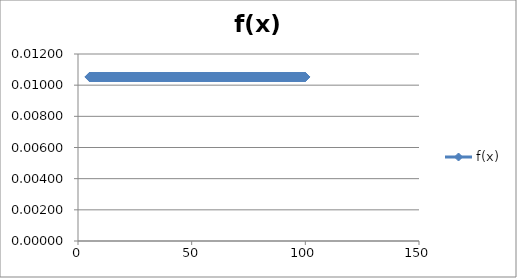
| Category | f(x) |
|---|---|
| 5.0 | 0.011 |
| 5.095 | 0.011 |
| 5.1899999999999995 | 0.011 |
| 5.284999999999999 | 0.011 |
| 5.379999999999999 | 0.011 |
| 5.474999999999999 | 0.011 |
| 5.5699999999999985 | 0.011 |
| 5.664999999999998 | 0.011 |
| 5.759999999999998 | 0.011 |
| 5.854999999999998 | 0.011 |
| 5.9499999999999975 | 0.011 |
| 6.044999999999997 | 0.011 |
| 6.139999999999997 | 0.011 |
| 6.234999999999997 | 0.011 |
| 6.3299999999999965 | 0.011 |
| 6.424999999999996 | 0.011 |
| 6.519999999999996 | 0.011 |
| 6.614999999999996 | 0.011 |
| 6.7099999999999955 | 0.011 |
| 6.804999999999995 | 0.011 |
| 6.899999999999995 | 0.011 |
| 6.994999999999995 | 0.011 |
| 7.0899999999999945 | 0.011 |
| 7.184999999999994 | 0.011 |
| 7.279999999999994 | 0.011 |
| 7.374999999999994 | 0.011 |
| 7.4699999999999935 | 0.011 |
| 7.564999999999993 | 0.011 |
| 7.659999999999993 | 0.011 |
| 7.754999999999993 | 0.011 |
| 7.8499999999999925 | 0.011 |
| 7.944999999999992 | 0.011 |
| 8.039999999999992 | 0.011 |
| 8.134999999999993 | 0.011 |
| 8.229999999999993 | 0.011 |
| 8.324999999999994 | 0.011 |
| 8.419999999999995 | 0.011 |
| 8.514999999999995 | 0.011 |
| 8.609999999999996 | 0.011 |
| 8.704999999999997 | 0.011 |
| 8.799999999999997 | 0.011 |
| 8.894999999999998 | 0.011 |
| 8.989999999999998 | 0.011 |
| 9.084999999999999 | 0.011 |
| 9.18 | 0.011 |
| 9.275 | 0.011 |
| 9.370000000000001 | 0.011 |
| 9.465000000000002 | 0.011 |
| 9.560000000000002 | 0.011 |
| 9.655000000000003 | 0.011 |
| 9.750000000000004 | 0.011 |
| 9.845000000000004 | 0.011 |
| 9.940000000000005 | 0.011 |
| 10.035000000000005 | 0.011 |
| 10.130000000000006 | 0.011 |
| 10.225000000000007 | 0.011 |
| 10.320000000000007 | 0.011 |
| 10.415000000000008 | 0.011 |
| 10.510000000000009 | 0.011 |
| 10.60500000000001 | 0.011 |
| 10.70000000000001 | 0.011 |
| 10.79500000000001 | 0.011 |
| 10.890000000000011 | 0.011 |
| 10.985000000000012 | 0.011 |
| 11.080000000000013 | 0.011 |
| 11.175000000000013 | 0.011 |
| 11.270000000000014 | 0.011 |
| 11.365000000000014 | 0.011 |
| 11.460000000000015 | 0.011 |
| 11.555000000000016 | 0.011 |
| 11.650000000000016 | 0.011 |
| 11.745000000000017 | 0.011 |
| 11.840000000000018 | 0.011 |
| 11.935000000000018 | 0.011 |
| 12.030000000000019 | 0.011 |
| 12.12500000000002 | 0.011 |
| 12.22000000000002 | 0.011 |
| 12.31500000000002 | 0.011 |
| 12.410000000000021 | 0.011 |
| 12.505000000000022 | 0.011 |
| 12.600000000000023 | 0.011 |
| 12.695000000000023 | 0.011 |
| 12.790000000000024 | 0.011 |
| 12.885000000000025 | 0.011 |
| 12.980000000000025 | 0.011 |
| 13.075000000000026 | 0.011 |
| 13.170000000000027 | 0.011 |
| 13.265000000000027 | 0.011 |
| 13.360000000000028 | 0.011 |
| 13.455000000000028 | 0.011 |
| 13.55000000000003 | 0.011 |
| 13.64500000000003 | 0.011 |
| 13.74000000000003 | 0.011 |
| 13.835000000000031 | 0.011 |
| 13.930000000000032 | 0.011 |
| 14.025000000000032 | 0.011 |
| 14.120000000000033 | 0.011 |
| 14.215000000000034 | 0.011 |
| 14.310000000000034 | 0.011 |
| 14.405000000000035 | 0.011 |
| 14.500000000000036 | 0.011 |
| 14.595000000000036 | 0.011 |
| 14.690000000000037 | 0.011 |
| 14.785000000000037 | 0.011 |
| 14.880000000000038 | 0.011 |
| 14.975000000000039 | 0.011 |
| 15.07000000000004 | 0.011 |
| 15.16500000000004 | 0.011 |
| 15.26000000000004 | 0.011 |
| 15.355000000000041 | 0.011 |
| 15.450000000000042 | 0.011 |
| 15.545000000000043 | 0.011 |
| 15.640000000000043 | 0.011 |
| 15.735000000000044 | 0.011 |
| 15.830000000000044 | 0.011 |
| 15.925000000000045 | 0.011 |
| 16.020000000000046 | 0.011 |
| 16.115000000000045 | 0.011 |
| 16.210000000000043 | 0.011 |
| 16.305000000000042 | 0.011 |
| 16.40000000000004 | 0.011 |
| 16.49500000000004 | 0.011 |
| 16.59000000000004 | 0.011 |
| 16.685000000000038 | 0.011 |
| 16.780000000000037 | 0.011 |
| 16.875000000000036 | 0.011 |
| 16.970000000000034 | 0.011 |
| 17.065000000000033 | 0.011 |
| 17.160000000000032 | 0.011 |
| 17.25500000000003 | 0.011 |
| 17.35000000000003 | 0.011 |
| 17.44500000000003 | 0.011 |
| 17.540000000000028 | 0.011 |
| 17.635000000000026 | 0.011 |
| 17.730000000000025 | 0.011 |
| 17.825000000000024 | 0.011 |
| 17.920000000000023 | 0.011 |
| 18.015000000000022 | 0.011 |
| 18.11000000000002 | 0.011 |
| 18.20500000000002 | 0.011 |
| 18.30000000000002 | 0.011 |
| 18.395000000000017 | 0.011 |
| 18.490000000000016 | 0.011 |
| 18.585000000000015 | 0.011 |
| 18.680000000000014 | 0.011 |
| 18.775000000000013 | 0.011 |
| 18.87000000000001 | 0.011 |
| 18.96500000000001 | 0.011 |
| 19.06000000000001 | 0.011 |
| 19.15500000000001 | 0.011 |
| 19.250000000000007 | 0.011 |
| 19.345000000000006 | 0.011 |
| 19.440000000000005 | 0.011 |
| 19.535000000000004 | 0.011 |
| 19.630000000000003 | 0.011 |
| 19.725 | 0.011 |
| 19.82 | 0.011 |
| 19.915 | 0.011 |
| 20.009999999999998 | 0.011 |
| 20.104999999999997 | 0.011 |
| 20.199999999999996 | 0.011 |
| 20.294999999999995 | 0.011 |
| 20.389999999999993 | 0.011 |
| 20.484999999999992 | 0.011 |
| 20.57999999999999 | 0.011 |
| 20.67499999999999 | 0.011 |
| 20.76999999999999 | 0.011 |
| 20.864999999999988 | 0.011 |
| 20.959999999999987 | 0.011 |
| 21.054999999999986 | 0.011 |
| 21.149999999999984 | 0.011 |
| 21.244999999999983 | 0.011 |
| 21.339999999999982 | 0.011 |
| 21.43499999999998 | 0.011 |
| 21.52999999999998 | 0.011 |
| 21.62499999999998 | 0.011 |
| 21.719999999999978 | 0.011 |
| 21.814999999999976 | 0.011 |
| 21.909999999999975 | 0.011 |
| 22.004999999999974 | 0.011 |
| 22.099999999999973 | 0.011 |
| 22.194999999999972 | 0.011 |
| 22.28999999999997 | 0.011 |
| 22.38499999999997 | 0.011 |
| 22.47999999999997 | 0.011 |
| 22.574999999999967 | 0.011 |
| 22.669999999999966 | 0.011 |
| 22.764999999999965 | 0.011 |
| 22.859999999999964 | 0.011 |
| 22.954999999999963 | 0.011 |
| 23.04999999999996 | 0.011 |
| 23.14499999999996 | 0.011 |
| 23.23999999999996 | 0.011 |
| 23.334999999999958 | 0.011 |
| 23.429999999999957 | 0.011 |
| 23.524999999999956 | 0.011 |
| 23.619999999999955 | 0.011 |
| 23.714999999999954 | 0.011 |
| 23.809999999999953 | 0.011 |
| 23.90499999999995 | 0.011 |
| 23.99999999999995 | 0.011 |
| 24.09499999999995 | 0.011 |
| 24.189999999999948 | 0.011 |
| 24.284999999999947 | 0.011 |
| 24.379999999999946 | 0.011 |
| 24.474999999999945 | 0.011 |
| 24.569999999999943 | 0.011 |
| 24.664999999999942 | 0.011 |
| 24.75999999999994 | 0.011 |
| 24.85499999999994 | 0.011 |
| 24.94999999999994 | 0.011 |
| 25.044999999999938 | 0.011 |
| 25.139999999999937 | 0.011 |
| 25.234999999999935 | 0.011 |
| 25.329999999999934 | 0.011 |
| 25.424999999999933 | 0.011 |
| 25.519999999999932 | 0.011 |
| 25.61499999999993 | 0.011 |
| 25.70999999999993 | 0.011 |
| 25.80499999999993 | 0.011 |
| 25.899999999999928 | 0.011 |
| 25.994999999999926 | 0.011 |
| 26.089999999999925 | 0.011 |
| 26.184999999999924 | 0.011 |
| 26.279999999999923 | 0.011 |
| 26.374999999999922 | 0.011 |
| 26.46999999999992 | 0.011 |
| 26.56499999999992 | 0.011 |
| 26.65999999999992 | 0.011 |
| 26.754999999999917 | 0.011 |
| 26.849999999999916 | 0.011 |
| 26.944999999999915 | 0.011 |
| 27.039999999999914 | 0.011 |
| 27.134999999999913 | 0.011 |
| 27.22999999999991 | 0.011 |
| 27.32499999999991 | 0.011 |
| 27.41999999999991 | 0.011 |
| 27.514999999999908 | 0.011 |
| 27.609999999999907 | 0.011 |
| 27.704999999999906 | 0.011 |
| 27.799999999999905 | 0.011 |
| 27.894999999999904 | 0.011 |
| 27.989999999999903 | 0.011 |
| 28.0849999999999 | 0.011 |
| 28.1799999999999 | 0.011 |
| 28.2749999999999 | 0.011 |
| 28.369999999999898 | 0.011 |
| 28.464999999999897 | 0.011 |
| 28.559999999999896 | 0.011 |
| 28.654999999999895 | 0.011 |
| 28.749999999999893 | 0.011 |
| 28.844999999999892 | 0.011 |
| 28.93999999999989 | 0.011 |
| 29.03499999999989 | 0.011 |
| 29.12999999999989 | 0.011 |
| 29.224999999999888 | 0.011 |
| 29.319999999999887 | 0.011 |
| 29.414999999999885 | 0.011 |
| 29.509999999999884 | 0.011 |
| 29.604999999999883 | 0.011 |
| 29.699999999999882 | 0.011 |
| 29.79499999999988 | 0.011 |
| 29.88999999999988 | 0.011 |
| 29.98499999999988 | 0.011 |
| 30.079999999999878 | 0.011 |
| 30.174999999999876 | 0.011 |
| 30.269999999999875 | 0.011 |
| 30.364999999999874 | 0.011 |
| 30.459999999999873 | 0.011 |
| 30.554999999999872 | 0.011 |
| 30.64999999999987 | 0.011 |
| 30.74499999999987 | 0.011 |
| 30.83999999999987 | 0.011 |
| 30.934999999999867 | 0.011 |
| 31.029999999999866 | 0.011 |
| 31.124999999999865 | 0.011 |
| 31.219999999999864 | 0.011 |
| 31.314999999999863 | 0.011 |
| 31.40999999999986 | 0.011 |
| 31.50499999999986 | 0.011 |
| 31.59999999999986 | 0.011 |
| 31.694999999999858 | 0.011 |
| 31.789999999999857 | 0.011 |
| 31.884999999999856 | 0.011 |
| 31.979999999999855 | 0.011 |
| 32.074999999999854 | 0.011 |
| 32.16999999999985 | 0.011 |
| 32.26499999999985 | 0.011 |
| 32.35999999999985 | 0.011 |
| 32.45499999999985 | 0.011 |
| 32.54999999999985 | 0.011 |
| 32.64499999999985 | 0.011 |
| 32.739999999999846 | 0.011 |
| 32.834999999999845 | 0.011 |
| 32.92999999999984 | 0.011 |
| 33.02499999999984 | 0.011 |
| 33.11999999999984 | 0.011 |
| 33.21499999999984 | 0.011 |
| 33.30999999999984 | 0.011 |
| 33.40499999999984 | 0.011 |
| 33.49999999999984 | 0.011 |
| 33.594999999999835 | 0.011 |
| 33.689999999999834 | 0.011 |
| 33.78499999999983 | 0.011 |
| 33.87999999999983 | 0.011 |
| 33.97499999999983 | 0.011 |
| 34.06999999999983 | 0.011 |
| 34.16499999999983 | 0.011 |
| 34.25999999999983 | 0.011 |
| 34.354999999999826 | 0.011 |
| 34.449999999999825 | 0.011 |
| 34.544999999999824 | 0.011 |
| 34.63999999999982 | 0.011 |
| 34.73499999999982 | 0.011 |
| 34.82999999999982 | 0.011 |
| 34.92499999999982 | 0.011 |
| 35.01999999999982 | 0.011 |
| 35.11499999999982 | 0.011 |
| 35.209999999999816 | 0.011 |
| 35.304999999999815 | 0.011 |
| 35.399999999999814 | 0.011 |
| 35.49499999999981 | 0.011 |
| 35.58999999999981 | 0.011 |
| 35.68499999999981 | 0.011 |
| 35.77999999999981 | 0.011 |
| 35.87499999999981 | 0.011 |
| 35.96999999999981 | 0.011 |
| 36.064999999999806 | 0.011 |
| 36.159999999999805 | 0.011 |
| 36.254999999999804 | 0.011 |
| 36.3499999999998 | 0.011 |
| 36.4449999999998 | 0.011 |
| 36.5399999999998 | 0.011 |
| 36.6349999999998 | 0.011 |
| 36.7299999999998 | 0.011 |
| 36.8249999999998 | 0.011 |
| 36.919999999999796 | 0.011 |
| 37.014999999999795 | 0.011 |
| 37.10999999999979 | 0.011 |
| 37.20499999999979 | 0.011 |
| 37.29999999999979 | 0.011 |
| 37.39499999999979 | 0.011 |
| 37.48999999999979 | 0.011 |
| 37.58499999999979 | 0.011 |
| 37.67999999999979 | 0.011 |
| 37.774999999999785 | 0.011 |
| 37.869999999999784 | 0.011 |
| 37.96499999999978 | 0.011 |
| 38.05999999999978 | 0.011 |
| 38.15499999999978 | 0.011 |
| 38.24999999999978 | 0.011 |
| 38.34499999999978 | 0.011 |
| 38.43999999999978 | 0.011 |
| 38.534999999999776 | 0.011 |
| 38.629999999999775 | 0.011 |
| 38.724999999999774 | 0.011 |
| 38.81999999999977 | 0.011 |
| 38.91499999999977 | 0.011 |
| 39.00999999999977 | 0.011 |
| 39.10499999999977 | 0.011 |
| 39.19999999999977 | 0.011 |
| 39.29499999999977 | 0.011 |
| 39.389999999999766 | 0.011 |
| 39.484999999999765 | 0.011 |
| 39.579999999999764 | 0.011 |
| 39.67499999999976 | 0.011 |
| 39.76999999999976 | 0.011 |
| 39.86499999999976 | 0.011 |
| 39.95999999999976 | 0.011 |
| 40.05499999999976 | 0.011 |
| 40.14999999999976 | 0.011 |
| 40.244999999999756 | 0.011 |
| 40.339999999999755 | 0.011 |
| 40.434999999999754 | 0.011 |
| 40.52999999999975 | 0.011 |
| 40.62499999999975 | 0.011 |
| 40.71999999999975 | 0.011 |
| 40.81499999999975 | 0.011 |
| 40.90999999999975 | 0.011 |
| 41.00499999999975 | 0.011 |
| 41.099999999999746 | 0.011 |
| 41.194999999999744 | 0.011 |
| 41.28999999999974 | 0.011 |
| 41.38499999999974 | 0.011 |
| 41.47999999999974 | 0.011 |
| 41.57499999999974 | 0.011 |
| 41.66999999999974 | 0.011 |
| 41.76499999999974 | 0.011 |
| 41.85999999999974 | 0.011 |
| 41.954999999999735 | 0.011 |
| 42.049999999999734 | 0.011 |
| 42.14499999999973 | 0.011 |
| 42.23999999999973 | 0.011 |
| 42.33499999999973 | 0.011 |
| 42.42999999999973 | 0.011 |
| 42.52499999999973 | 0.011 |
| 42.61999999999973 | 0.011 |
| 42.714999999999726 | 0.011 |
| 42.809999999999725 | 0.011 |
| 42.904999999999724 | 0.011 |
| 42.99999999999972 | 0.011 |
| 43.09499999999972 | 0.011 |
| 43.18999999999972 | 0.011 |
| 43.28499999999972 | 0.011 |
| 43.37999999999972 | 0.011 |
| 43.47499999999972 | 0.011 |
| 43.569999999999716 | 0.011 |
| 43.664999999999715 | 0.011 |
| 43.759999999999714 | 0.011 |
| 43.85499999999971 | 0.011 |
| 43.94999999999971 | 0.011 |
| 44.04499999999971 | 0.011 |
| 44.13999999999971 | 0.011 |
| 44.23499999999971 | 0.011 |
| 44.32999999999971 | 0.011 |
| 44.424999999999706 | 0.011 |
| 44.519999999999705 | 0.011 |
| 44.614999999999704 | 0.011 |
| 44.7099999999997 | 0.011 |
| 44.8049999999997 | 0.011 |
| 44.8999999999997 | 0.011 |
| 44.9949999999997 | 0.011 |
| 45.0899999999997 | 0.011 |
| 45.1849999999997 | 0.011 |
| 45.279999999999696 | 0.011 |
| 45.374999999999694 | 0.011 |
| 45.46999999999969 | 0.011 |
| 45.56499999999969 | 0.011 |
| 45.65999999999969 | 0.011 |
| 45.75499999999969 | 0.011 |
| 45.84999999999969 | 0.011 |
| 45.94499999999969 | 0.011 |
| 46.03999999999969 | 0.011 |
| 46.134999999999685 | 0.011 |
| 46.229999999999684 | 0.011 |
| 46.32499999999968 | 0.011 |
| 46.41999999999968 | 0.011 |
| 46.51499999999968 | 0.011 |
| 46.60999999999968 | 0.011 |
| 46.70499999999968 | 0.011 |
| 46.79999999999968 | 0.011 |
| 46.894999999999676 | 0.011 |
| 46.989999999999675 | 0.011 |
| 47.084999999999674 | 0.011 |
| 47.17999999999967 | 0.011 |
| 47.27499999999967 | 0.011 |
| 47.36999999999967 | 0.011 |
| 47.46499999999967 | 0.011 |
| 47.55999999999967 | 0.011 |
| 47.65499999999967 | 0.011 |
| 47.749999999999666 | 0.011 |
| 47.844999999999665 | 0.011 |
| 47.939999999999664 | 0.011 |
| 48.03499999999966 | 0.011 |
| 48.12999999999966 | 0.011 |
| 48.22499999999966 | 0.011 |
| 48.31999999999966 | 0.011 |
| 48.41499999999966 | 0.011 |
| 48.50999999999966 | 0.011 |
| 48.604999999999656 | 0.011 |
| 48.699999999999655 | 0.011 |
| 48.79499999999965 | 0.011 |
| 48.88999999999965 | 0.011 |
| 48.98499999999965 | 0.011 |
| 49.07999999999965 | 0.011 |
| 49.17499999999965 | 0.011 |
| 49.26999999999965 | 0.011 |
| 49.36499999999965 | 0.011 |
| 49.459999999999646 | 0.011 |
| 49.554999999999644 | 0.011 |
| 49.64999999999964 | 0.011 |
| 49.74499999999964 | 0.011 |
| 49.83999999999964 | 0.011 |
| 49.93499999999964 | 0.011 |
| 50.02999999999964 | 0.011 |
| 50.12499999999964 | 0.011 |
| 50.21999999999964 | 0.011 |
| 50.314999999999635 | 0.011 |
| 50.409999999999634 | 0.011 |
| 50.50499999999963 | 0.011 |
| 50.59999999999963 | 0.011 |
| 50.69499999999963 | 0.011 |
| 50.78999999999963 | 0.011 |
| 50.88499999999963 | 0.011 |
| 50.97999999999963 | 0.011 |
| 51.074999999999626 | 0.011 |
| 51.169999999999625 | 0.011 |
| 51.264999999999624 | 0.011 |
| 51.35999999999962 | 0.011 |
| 51.45499999999962 | 0.011 |
| 51.54999999999962 | 0.011 |
| 51.64499999999962 | 0.011 |
| 51.73999999999962 | 0.011 |
| 51.83499999999962 | 0.011 |
| 51.929999999999616 | 0.011 |
| 52.024999999999615 | 0.011 |
| 52.119999999999614 | 0.011 |
| 52.21499999999961 | 0.011 |
| 52.30999999999961 | 0.011 |
| 52.40499999999961 | 0.011 |
| 52.49999999999961 | 0.011 |
| 52.59499999999961 | 0.011 |
| 52.68999999999961 | 0.011 |
| 52.784999999999606 | 0.011 |
| 52.879999999999605 | 0.011 |
| 52.9749999999996 | 0.011 |
| 53.0699999999996 | 0.011 |
| 53.1649999999996 | 0.011 |
| 53.2599999999996 | 0.011 |
| 53.3549999999996 | 0.011 |
| 53.4499999999996 | 0.011 |
| 53.5449999999996 | 0.011 |
| 53.639999999999596 | 0.011 |
| 53.734999999999594 | 0.011 |
| 53.82999999999959 | 0.011 |
| 53.92499999999959 | 0.011 |
| 54.01999999999959 | 0.011 |
| 54.11499999999959 | 0.011 |
| 54.20999999999959 | 0.011 |
| 54.30499999999959 | 0.011 |
| 54.39999999999959 | 0.011 |
| 54.494999999999585 | 0.011 |
| 54.589999999999584 | 0.011 |
| 54.68499999999958 | 0.011 |
| 54.77999999999958 | 0.011 |
| 54.87499999999958 | 0.011 |
| 54.96999999999958 | 0.011 |
| 55.06499999999958 | 0.011 |
| 55.15999999999958 | 0.011 |
| 55.254999999999576 | 0.011 |
| 55.349999999999575 | 0.011 |
| 55.444999999999574 | 0.011 |
| 55.53999999999957 | 0.011 |
| 55.63499999999957 | 0.011 |
| 55.72999999999957 | 0.011 |
| 55.82499999999957 | 0.011 |
| 55.91999999999957 | 0.011 |
| 56.01499999999957 | 0.011 |
| 56.109999999999566 | 0.011 |
| 56.204999999999565 | 0.011 |
| 56.299999999999564 | 0.011 |
| 56.39499999999956 | 0.011 |
| 56.48999999999956 | 0.011 |
| 56.58499999999956 | 0.011 |
| 56.67999999999956 | 0.011 |
| 56.77499999999956 | 0.011 |
| 56.86999999999956 | 0.011 |
| 56.964999999999556 | 0.011 |
| 57.059999999999555 | 0.011 |
| 57.15499999999955 | 0.011 |
| 57.24999999999955 | 0.011 |
| 57.34499999999955 | 0.011 |
| 57.43999999999955 | 0.011 |
| 57.53499999999955 | 0.011 |
| 57.62999999999955 | 0.011 |
| 57.72499999999955 | 0.011 |
| 57.819999999999546 | 0.011 |
| 57.914999999999544 | 0.011 |
| 58.00999999999954 | 0.011 |
| 58.10499999999954 | 0.011 |
| 58.19999999999954 | 0.011 |
| 58.29499999999954 | 0.011 |
| 58.38999999999954 | 0.011 |
| 58.48499999999954 | 0.011 |
| 58.579999999999536 | 0.011 |
| 58.674999999999535 | 0.011 |
| 58.769999999999534 | 0.011 |
| 58.86499999999953 | 0.011 |
| 58.95999999999953 | 0.011 |
| 59.05499999999953 | 0.011 |
| 59.14999999999953 | 0.011 |
| 59.24499999999953 | 0.011 |
| 59.33999999999953 | 0.011 |
| 59.434999999999526 | 0.011 |
| 59.529999999999525 | 0.011 |
| 59.624999999999524 | 0.011 |
| 59.71999999999952 | 0.011 |
| 59.81499999999952 | 0.011 |
| 59.90999999999952 | 0.011 |
| 60.00499999999952 | 0.011 |
| 60.09999999999952 | 0.011 |
| 60.19499999999952 | 0.011 |
| 60.289999999999516 | 0.011 |
| 60.384999999999515 | 0.011 |
| 60.479999999999514 | 0.011 |
| 60.57499999999951 | 0.011 |
| 60.66999999999951 | 0.011 |
| 60.76499999999951 | 0.011 |
| 60.85999999999951 | 0.011 |
| 60.95499999999951 | 0.011 |
| 61.04999999999951 | 0.011 |
| 61.144999999999506 | 0.011 |
| 61.239999999999505 | 0.011 |
| 61.3349999999995 | 0.011 |
| 61.4299999999995 | 0.011 |
| 61.5249999999995 | 0.011 |
| 61.6199999999995 | 0.011 |
| 61.7149999999995 | 0.011 |
| 61.8099999999995 | 0.011 |
| 61.9049999999995 | 0.011 |
| 61.999999999999496 | 0.011 |
| 62.094999999999494 | 0.011 |
| 62.18999999999949 | 0.011 |
| 62.28499999999949 | 0.011 |
| 62.37999999999949 | 0.011 |
| 62.47499999999949 | 0.011 |
| 62.56999999999949 | 0.011 |
| 62.66499999999949 | 0.011 |
| 62.759999999999486 | 0.011 |
| 62.854999999999485 | 0.011 |
| 62.949999999999484 | 0.011 |
| 63.04499999999948 | 0.011 |
| 63.13999999999948 | 0.011 |
| 63.23499999999948 | 0.011 |
| 63.32999999999948 | 0.011 |
| 63.42499999999948 | 0.011 |
| 63.51999999999948 | 0.011 |
| 63.614999999999476 | 0.011 |
| 63.709999999999475 | 0.011 |
| 63.804999999999474 | 0.011 |
| 63.89999999999947 | 0.011 |
| 63.99499999999947 | 0.011 |
| 64.08999999999948 | 0.011 |
| 64.18499999999948 | 0.011 |
| 64.27999999999948 | 0.011 |
| 64.37499999999947 | 0.011 |
| 64.46999999999947 | 0.011 |
| 64.56499999999947 | 0.011 |
| 64.65999999999947 | 0.011 |
| 64.75499999999947 | 0.011 |
| 64.84999999999947 | 0.011 |
| 64.94499999999947 | 0.011 |
| 65.03999999999947 | 0.011 |
| 65.13499999999947 | 0.011 |
| 65.22999999999946 | 0.011 |
| 65.32499999999946 | 0.011 |
| 65.41999999999946 | 0.011 |
| 65.51499999999946 | 0.011 |
| 65.60999999999946 | 0.011 |
| 65.70499999999946 | 0.011 |
| 65.79999999999946 | 0.011 |
| 65.89499999999946 | 0.011 |
| 65.98999999999945 | 0.011 |
| 66.08499999999945 | 0.011 |
| 66.17999999999945 | 0.011 |
| 66.27499999999945 | 0.011 |
| 66.36999999999945 | 0.011 |
| 66.46499999999945 | 0.011 |
| 66.55999999999945 | 0.011 |
| 66.65499999999945 | 0.011 |
| 66.74999999999945 | 0.011 |
| 66.84499999999944 | 0.011 |
| 66.93999999999944 | 0.011 |
| 67.03499999999944 | 0.011 |
| 67.12999999999944 | 0.011 |
| 67.22499999999944 | 0.011 |
| 67.31999999999944 | 0.011 |
| 67.41499999999944 | 0.011 |
| 67.50999999999944 | 0.011 |
| 67.60499999999944 | 0.011 |
| 67.69999999999943 | 0.011 |
| 67.79499999999943 | 0.011 |
| 67.88999999999943 | 0.011 |
| 67.98499999999943 | 0.011 |
| 68.07999999999943 | 0.011 |
| 68.17499999999943 | 0.011 |
| 68.26999999999943 | 0.011 |
| 68.36499999999943 | 0.011 |
| 68.45999999999943 | 0.011 |
| 68.55499999999942 | 0.011 |
| 68.64999999999942 | 0.011 |
| 68.74499999999942 | 0.011 |
| 68.83999999999942 | 0.011 |
| 68.93499999999942 | 0.011 |
| 69.02999999999942 | 0.011 |
| 69.12499999999942 | 0.011 |
| 69.21999999999942 | 0.011 |
| 69.31499999999942 | 0.011 |
| 69.40999999999941 | 0.011 |
| 69.50499999999941 | 0.011 |
| 69.59999999999941 | 0.011 |
| 69.69499999999941 | 0.011 |
| 69.78999999999941 | 0.011 |
| 69.88499999999941 | 0.011 |
| 69.97999999999941 | 0.011 |
| 70.0749999999994 | 0.011 |
| 70.1699999999994 | 0.011 |
| 70.2649999999994 | 0.011 |
| 70.3599999999994 | 0.011 |
| 70.4549999999994 | 0.011 |
| 70.5499999999994 | 0.011 |
| 70.6449999999994 | 0.011 |
| 70.7399999999994 | 0.011 |
| 70.8349999999994 | 0.011 |
| 70.9299999999994 | 0.011 |
| 71.0249999999994 | 0.011 |
| 71.1199999999994 | 0.011 |
| 71.21499999999939 | 0.011 |
| 71.30999999999939 | 0.011 |
| 71.40499999999939 | 0.011 |
| 71.49999999999939 | 0.011 |
| 71.59499999999939 | 0.011 |
| 71.68999999999939 | 0.011 |
| 71.78499999999939 | 0.011 |
| 71.87999999999938 | 0.011 |
| 71.97499999999938 | 0.011 |
| 72.06999999999938 | 0.011 |
| 72.16499999999938 | 0.011 |
| 72.25999999999938 | 0.011 |
| 72.35499999999938 | 0.011 |
| 72.44999999999938 | 0.011 |
| 72.54499999999938 | 0.011 |
| 72.63999999999938 | 0.011 |
| 72.73499999999937 | 0.011 |
| 72.82999999999937 | 0.011 |
| 72.92499999999937 | 0.011 |
| 73.01999999999937 | 0.011 |
| 73.11499999999937 | 0.011 |
| 73.20999999999937 | 0.011 |
| 73.30499999999937 | 0.011 |
| 73.39999999999937 | 0.011 |
| 73.49499999999937 | 0.011 |
| 73.58999999999936 | 0.011 |
| 73.68499999999936 | 0.011 |
| 73.77999999999936 | 0.011 |
| 73.87499999999936 | 0.011 |
| 73.96999999999936 | 0.011 |
| 74.06499999999936 | 0.011 |
| 74.15999999999936 | 0.011 |
| 74.25499999999936 | 0.011 |
| 74.34999999999935 | 0.011 |
| 74.44499999999935 | 0.011 |
| 74.53999999999935 | 0.011 |
| 74.63499999999935 | 0.011 |
| 74.72999999999935 | 0.011 |
| 74.82499999999935 | 0.011 |
| 74.91999999999935 | 0.011 |
| 75.01499999999935 | 0.011 |
| 75.10999999999935 | 0.011 |
| 75.20499999999934 | 0.011 |
| 75.29999999999934 | 0.011 |
| 75.39499999999934 | 0.011 |
| 75.48999999999934 | 0.011 |
| 75.58499999999934 | 0.011 |
| 75.67999999999934 | 0.011 |
| 75.77499999999934 | 0.011 |
| 75.86999999999934 | 0.011 |
| 75.96499999999934 | 0.011 |
| 76.05999999999933 | 0.011 |
| 76.15499999999933 | 0.011 |
| 76.24999999999933 | 0.011 |
| 76.34499999999933 | 0.011 |
| 76.43999999999933 | 0.011 |
| 76.53499999999933 | 0.011 |
| 76.62999999999933 | 0.011 |
| 76.72499999999933 | 0.011 |
| 76.81999999999933 | 0.011 |
| 76.91499999999932 | 0.011 |
| 77.00999999999932 | 0.011 |
| 77.10499999999932 | 0.011 |
| 77.19999999999932 | 0.011 |
| 77.29499999999932 | 0.011 |
| 77.38999999999932 | 0.011 |
| 77.48499999999932 | 0.011 |
| 77.57999999999932 | 0.011 |
| 77.67499999999932 | 0.011 |
| 77.76999999999931 | 0.011 |
| 77.86499999999931 | 0.011 |
| 77.95999999999931 | 0.011 |
| 78.05499999999931 | 0.011 |
| 78.14999999999931 | 0.011 |
| 78.24499999999931 | 0.011 |
| 78.3399999999993 | 0.011 |
| 78.4349999999993 | 0.011 |
| 78.5299999999993 | 0.011 |
| 78.6249999999993 | 0.011 |
| 78.7199999999993 | 0.011 |
| 78.8149999999993 | 0.011 |
| 78.9099999999993 | 0.011 |
| 79.0049999999993 | 0.011 |
| 79.0999999999993 | 0.011 |
| 79.1949999999993 | 0.011 |
| 79.2899999999993 | 0.011 |
| 79.3849999999993 | 0.011 |
| 79.4799999999993 | 0.011 |
| 79.57499999999929 | 0.011 |
| 79.66999999999929 | 0.011 |
| 79.76499999999929 | 0.011 |
| 79.85999999999929 | 0.011 |
| 79.95499999999929 | 0.011 |
| 80.04999999999929 | 0.011 |
| 80.14499999999929 | 0.011 |
| 80.23999999999928 | 0.011 |
| 80.33499999999928 | 0.011 |
| 80.42999999999928 | 0.011 |
| 80.52499999999928 | 0.011 |
| 80.61999999999928 | 0.011 |
| 80.71499999999928 | 0.011 |
| 80.80999999999928 | 0.011 |
| 80.90499999999928 | 0.011 |
| 80.99999999999928 | 0.011 |
| 81.09499999999927 | 0.011 |
| 81.18999999999927 | 0.011 |
| 81.28499999999927 | 0.011 |
| 81.37999999999927 | 0.011 |
| 81.47499999999927 | 0.011 |
| 81.56999999999927 | 0.011 |
| 81.66499999999927 | 0.011 |
| 81.75999999999927 | 0.011 |
| 81.85499999999927 | 0.011 |
| 81.94999999999926 | 0.011 |
| 82.04499999999926 | 0.011 |
| 82.13999999999926 | 0.011 |
| 82.23499999999926 | 0.011 |
| 82.32999999999926 | 0.011 |
| 82.42499999999926 | 0.011 |
| 82.51999999999926 | 0.011 |
| 82.61499999999926 | 0.011 |
| 82.70999999999925 | 0.011 |
| 82.80499999999925 | 0.011 |
| 82.89999999999925 | 0.011 |
| 82.99499999999925 | 0.011 |
| 83.08999999999925 | 0.011 |
| 83.18499999999925 | 0.011 |
| 83.27999999999925 | 0.011 |
| 83.37499999999925 | 0.011 |
| 83.46999999999925 | 0.011 |
| 83.56499999999924 | 0.011 |
| 83.65999999999924 | 0.011 |
| 83.75499999999924 | 0.011 |
| 83.84999999999924 | 0.011 |
| 83.94499999999924 | 0.011 |
| 84.03999999999924 | 0.011 |
| 84.13499999999924 | 0.011 |
| 84.22999999999924 | 0.011 |
| 84.32499999999924 | 0.011 |
| 84.41999999999923 | 0.011 |
| 84.51499999999923 | 0.011 |
| 84.60999999999923 | 0.011 |
| 84.70499999999923 | 0.011 |
| 84.79999999999923 | 0.011 |
| 84.89499999999923 | 0.011 |
| 84.98999999999923 | 0.011 |
| 85.08499999999923 | 0.011 |
| 85.17999999999923 | 0.011 |
| 85.27499999999922 | 0.011 |
| 85.36999999999922 | 0.011 |
| 85.46499999999922 | 0.011 |
| 85.55999999999922 | 0.011 |
| 85.65499999999922 | 0.011 |
| 85.74999999999922 | 0.011 |
| 85.84499999999922 | 0.011 |
| 85.93999999999922 | 0.011 |
| 86.03499999999921 | 0.011 |
| 86.12999999999921 | 0.011 |
| 86.22499999999921 | 0.011 |
| 86.31999999999921 | 0.011 |
| 86.41499999999921 | 0.011 |
| 86.50999999999921 | 0.011 |
| 86.60499999999921 | 0.011 |
| 86.6999999999992 | 0.011 |
| 86.7949999999992 | 0.011 |
| 86.8899999999992 | 0.011 |
| 86.9849999999992 | 0.011 |
| 87.0799999999992 | 0.011 |
| 87.1749999999992 | 0.011 |
| 87.2699999999992 | 0.011 |
| 87.3649999999992 | 0.011 |
| 87.4599999999992 | 0.011 |
| 87.5549999999992 | 0.011 |
| 87.6499999999992 | 0.011 |
| 87.7449999999992 | 0.011 |
| 87.8399999999992 | 0.011 |
| 87.93499999999919 | 0.011 |
| 88.02999999999919 | 0.011 |
| 88.12499999999919 | 0.011 |
| 88.21999999999919 | 0.011 |
| 88.31499999999919 | 0.011 |
| 88.40999999999919 | 0.011 |
| 88.50499999999919 | 0.011 |
| 88.59999999999918 | 0.011 |
| 88.69499999999918 | 0.011 |
| 88.78999999999918 | 0.011 |
| 88.88499999999918 | 0.011 |
| 88.97999999999918 | 0.011 |
| 89.07499999999918 | 0.011 |
| 89.16999999999918 | 0.011 |
| 89.26499999999918 | 0.011 |
| 89.35999999999918 | 0.011 |
| 89.45499999999917 | 0.011 |
| 89.54999999999917 | 0.011 |
| 89.64499999999917 | 0.011 |
| 89.73999999999917 | 0.011 |
| 89.83499999999917 | 0.011 |
| 89.92999999999917 | 0.011 |
| 90.02499999999917 | 0.011 |
| 90.11999999999917 | 0.011 |
| 90.21499999999916 | 0.011 |
| 90.30999999999916 | 0.011 |
| 90.40499999999916 | 0.011 |
| 90.49999999999916 | 0.011 |
| 90.59499999999916 | 0.011 |
| 90.68999999999916 | 0.011 |
| 90.78499999999916 | 0.011 |
| 90.87999999999916 | 0.011 |
| 90.97499999999916 | 0.011 |
| 91.06999999999915 | 0.011 |
| 91.16499999999915 | 0.011 |
| 91.25999999999915 | 0.011 |
| 91.35499999999915 | 0.011 |
| 91.44999999999915 | 0.011 |
| 91.54499999999915 | 0.011 |
| 91.63999999999915 | 0.011 |
| 91.73499999999915 | 0.011 |
| 91.82999999999915 | 0.011 |
| 91.92499999999914 | 0.011 |
| 92.01999999999914 | 0.011 |
| 92.11499999999914 | 0.011 |
| 92.20999999999914 | 0.011 |
| 92.30499999999914 | 0.011 |
| 92.39999999999914 | 0.011 |
| 92.49499999999914 | 0.011 |
| 92.58999999999914 | 0.011 |
| 92.68499999999914 | 0.011 |
| 92.77999999999913 | 0.011 |
| 92.87499999999913 | 0.011 |
| 92.96999999999913 | 0.011 |
| 93.06499999999913 | 0.011 |
| 93.15999999999913 | 0.011 |
| 93.25499999999913 | 0.011 |
| 93.34999999999913 | 0.011 |
| 93.44499999999913 | 0.011 |
| 93.53999999999913 | 0.011 |
| 93.63499999999912 | 0.011 |
| 93.72999999999912 | 0.011 |
| 93.82499999999912 | 0.011 |
| 93.91999999999912 | 0.011 |
| 94.01499999999912 | 0.011 |
| 94.10999999999912 | 0.011 |
| 94.20499999999912 | 0.011 |
| 94.29999999999912 | 0.011 |
| 94.39499999999911 | 0.011 |
| 94.48999999999911 | 0.011 |
| 94.58499999999911 | 0.011 |
| 94.67999999999911 | 0.011 |
| 94.77499999999911 | 0.011 |
| 94.86999999999911 | 0.011 |
| 94.96499999999911 | 0.011 |
| 95.0599999999991 | 0.011 |
| 95.1549999999991 | 0.011 |
| 95.2499999999991 | 0.011 |
| 95.3449999999991 | 0.011 |
| 95.4399999999991 | 0.011 |
| 95.5349999999991 | 0.011 |
| 95.6299999999991 | 0.011 |
| 95.7249999999991 | 0.011 |
| 95.8199999999991 | 0.011 |
| 95.9149999999991 | 0.011 |
| 96.0099999999991 | 0.011 |
| 96.1049999999991 | 0.011 |
| 96.1999999999991 | 0.011 |
| 96.29499999999909 | 0.011 |
| 96.38999999999909 | 0.011 |
| 96.48499999999909 | 0.011 |
| 96.57999999999909 | 0.011 |
| 96.67499999999909 | 0.011 |
| 96.76999999999909 | 0.011 |
| 96.86499999999909 | 0.011 |
| 96.95999999999908 | 0.011 |
| 97.05499999999908 | 0.011 |
| 97.14999999999908 | 0.011 |
| 97.24499999999908 | 0.011 |
| 97.33999999999908 | 0.011 |
| 97.43499999999908 | 0.011 |
| 97.52999999999908 | 0.011 |
| 97.62499999999908 | 0.011 |
| 97.71999999999908 | 0.011 |
| 97.81499999999907 | 0.011 |
| 97.90999999999907 | 0.011 |
| 98.00499999999907 | 0.011 |
| 98.09999999999907 | 0.011 |
| 98.19499999999907 | 0.011 |
| 98.28999999999907 | 0.011 |
| 98.38499999999907 | 0.011 |
| 98.47999999999907 | 0.011 |
| 98.57499999999906 | 0.011 |
| 98.66999999999906 | 0.011 |
| 98.76499999999906 | 0.011 |
| 98.85999999999906 | 0.011 |
| 98.95499999999906 | 0.011 |
| 99.04999999999906 | 0.011 |
| 99.14499999999906 | 0.011 |
| 99.23999999999906 | 0.011 |
| 99.33499999999906 | 0.011 |
| 99.42999999999905 | 0.011 |
| 99.52499999999905 | 0.011 |
| 99.61999999999905 | 0.011 |
| 99.71499999999905 | 0.011 |
| 99.80999999999905 | 0.011 |
| 99.90499999999905 | 0.011 |
| 100.0 | 0.011 |